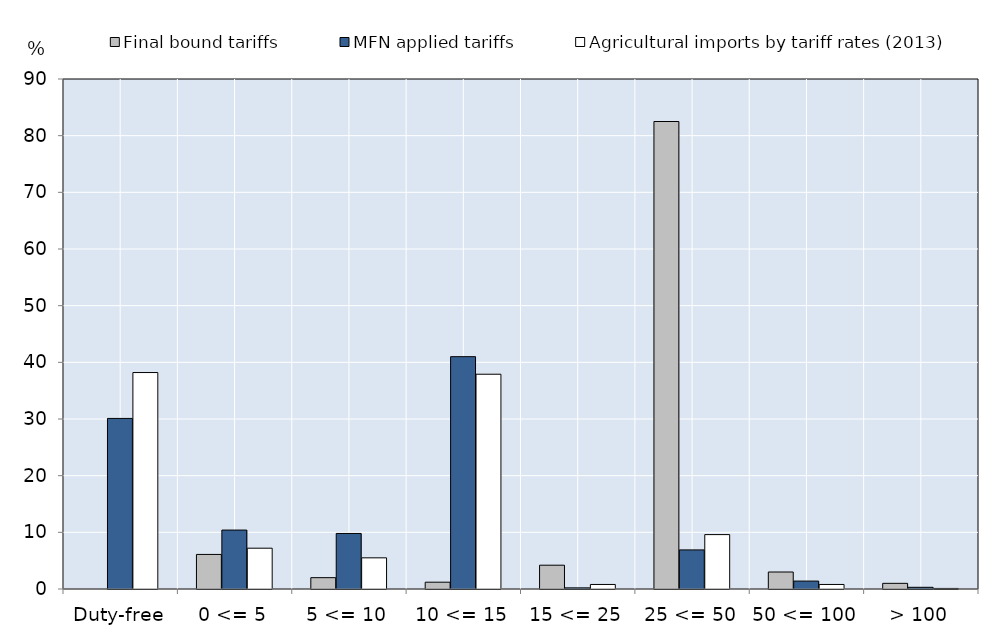
| Category | Final bound tariffs | MFN applied tariffs | Agricultural imports by tariff rates (2013) |
|---|---|---|---|
| Duty-free | 0 | 30.1 | 38.2 |
| 0 <= 5 | 6.1 | 10.4 | 7.2 |
| 5 <= 10 | 2 | 9.8 | 5.5 |
| 10 <= 15 | 1.2 | 41 | 37.9 |
| 15 <= 25 | 4.2 | 0.2 | 0.8 |
| 25 <= 50 | 82.5 | 6.9 | 9.6 |
| 50 <= 100 | 3 | 1.4 | 0.8 |
| > 100 | 1 | 0.3 | 0.1 |